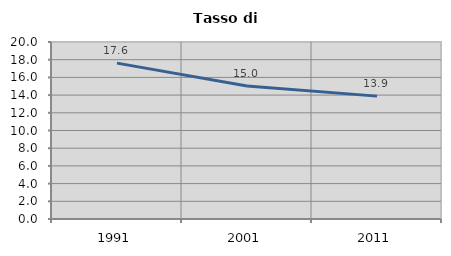
| Category | Tasso di disoccupazione   |
|---|---|
| 1991.0 | 17.615 |
| 2001.0 | 15.033 |
| 2011.0 | 13.884 |